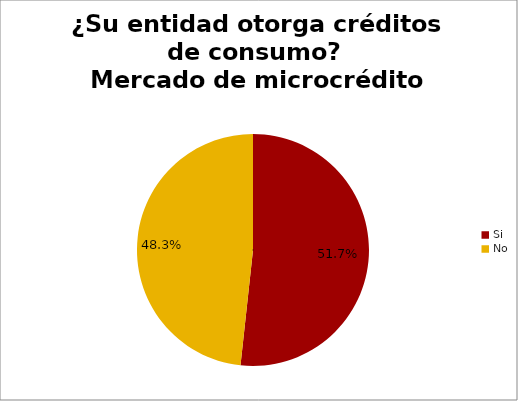
| Category | ¿Su entidad otorga créditos de consumo? Mercado de microcrédito |
|---|---|
| Si | 0.517 |
| No | 0.483 |